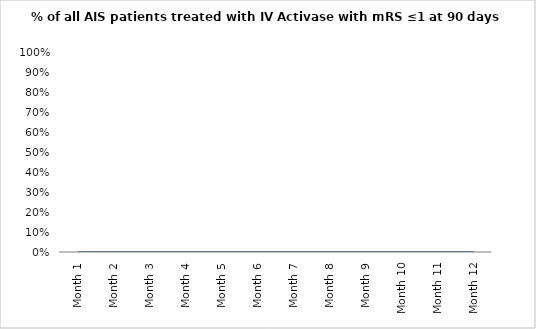
| Category | % of all AIS patients treated with IV Activase with mRS ≤1 at 90 days |
|---|---|
| Month 1 | 0 |
| Month 2 | 0 |
| Month 3 | 0 |
| Month 4 | 0 |
| Month 5 | 0 |
| Month 6 | 0 |
| Month 7 | 0 |
| Month 8 | 0 |
| Month 9 | 0 |
| Month 10 | 0 |
| Month 11 | 0 |
| Month 12 | 0 |